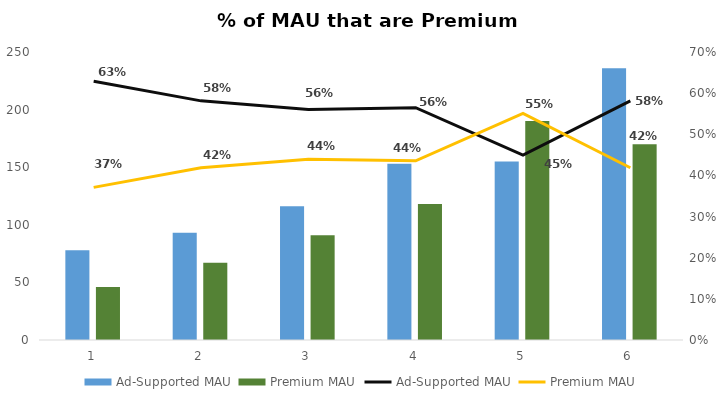
| Category | Ad-Supported MAU | Premium MAU |
|---|---|---|
| 0 | 78 | 46 |
| 1 | 93 | 67 |
| 2 | 116 | 91 |
| 3 | 153 | 118 |
| 4 | 155 | 190 |
| 5 | 236 | 170 |